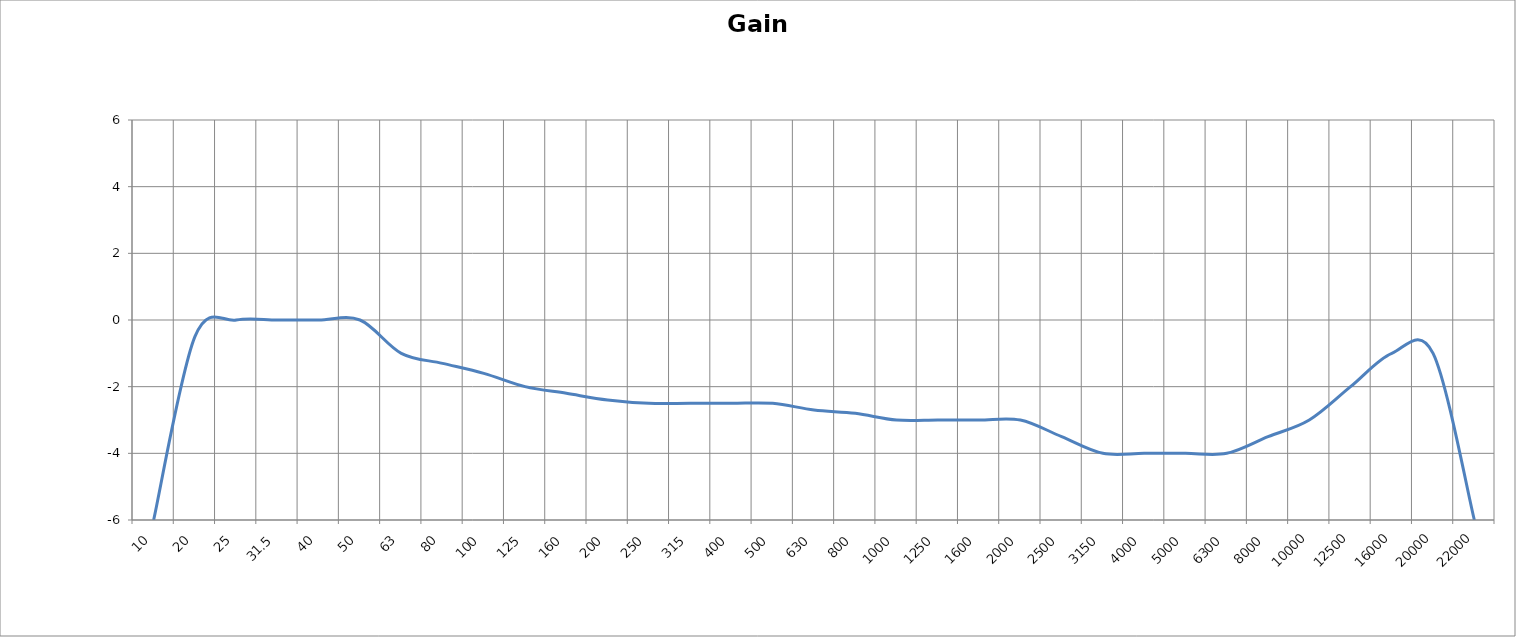
| Category | Gain |
|---|---|
| 10.0 | -6 |
| 20.0 | -0.5 |
| 25.0 | 0 |
| 31.5 | 0 |
| 40.0 | 0 |
| 50.0 | 0 |
| 63.0 | -1 |
| 80.0 | -1.3 |
| 100.0 | -1.6 |
| 125.0 | -2 |
| 160.0 | -2.2 |
| 200.0 | -2.4 |
| 250.0 | -2.5 |
| 315.0 | -2.5 |
| 400.0 | -2.5 |
| 500.0 | -2.5 |
| 630.0 | -2.7 |
| 800.0 | -2.8 |
| 1000.0 | -3 |
| 1250.0 | -3 |
| 1600.0 | -3 |
| 2000.0 | -3 |
| 2500.0 | -3.5 |
| 3150.0 | -4 |
| 4000.0 | -4 |
| 5000.0 | -4 |
| 6300.0 | -4 |
| 8000.0 | -3.5 |
| 10000.0 | -3 |
| 12500.0 | -2 |
| 16000.0 | -1 |
| 20000.0 | -1 |
| 22000.0 | -6 |